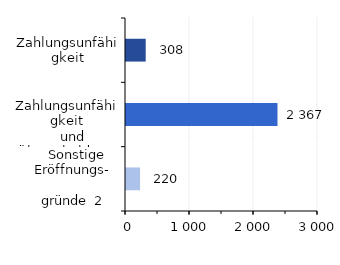
| Category | Series 0 |
|---|---|
| Zahlungsunfähigkeit | 308 |
|   Zahlungsunfähigkeit
   und Überschuldung | 2367 |
|   Sonstige Eröffnungs-
                      gründe  2 | 220 |